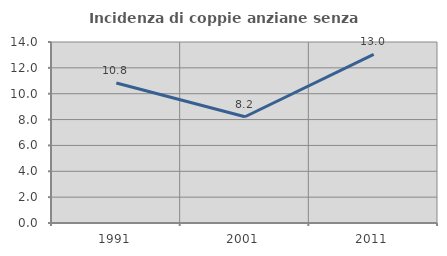
| Category | Incidenza di coppie anziane senza figli  |
|---|---|
| 1991.0 | 10.833 |
| 2001.0 | 8.219 |
| 2011.0 | 13.043 |